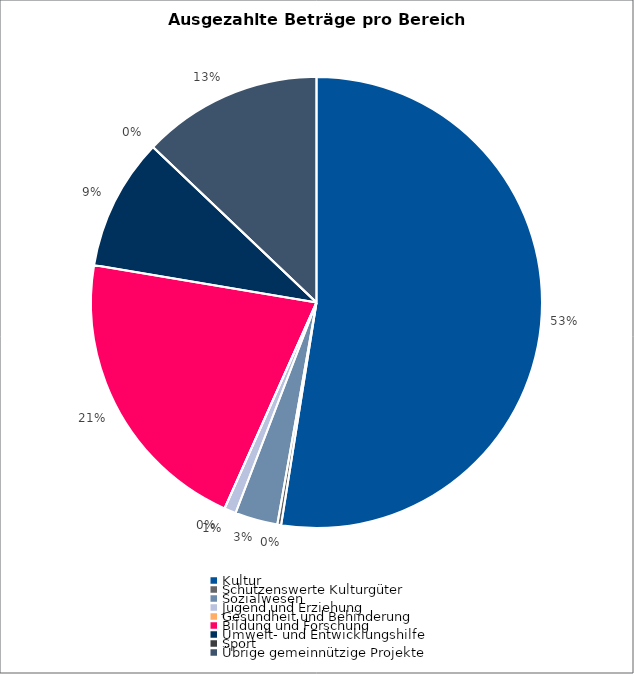
| Category | Series 0 |
|---|---|
| Kultur | 21618201 |
| Schützenswerte Kulturgüter | 113705 |
| Sozialwesen | 1258000 |
| Jugend und Erziehung | 345666 |
| Gesundheit und Behinderung | 3000 |
| Bildung und Forschung | 8632710 |
| Umwelt- und Entwicklungshilfe | 3888402 |
| Sport | 0 |
| Übrige gemeinnützige Projekte | 5312312 |